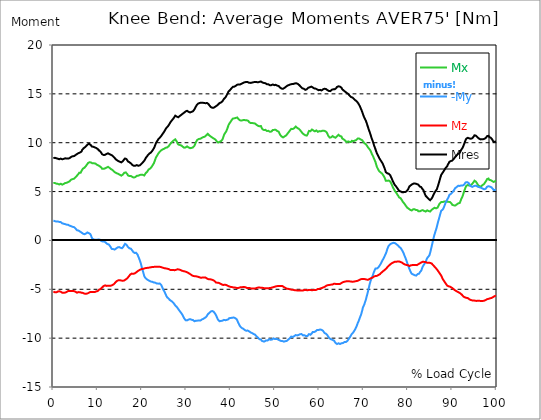
| Category |  Mx |  -My |  Mz |  Mres |
|---|---|---|---|---|
| 0.0 | 5.866 | 2.02 | -5.238 | 8.421 |
| 0.167348456675344 | 5.892 | 1.995 | -5.28 | 8.455 |
| 0.334696913350688 | 5.875 | 1.978 | -5.306 | 8.455 |
| 0.5020453700260321 | 5.858 | 1.961 | -5.314 | 8.447 |
| 0.669393826701376 | 5.815 | 1.927 | -5.314 | 8.413 |
| 0.83674228337672 | 5.781 | 1.927 | -5.263 | 8.37 |
| 1.0040907400520642 | 5.79 | 1.944 | -5.229 | 8.362 |
| 1.1621420602454444 | 5.773 | 1.936 | -5.204 | 8.345 |
| 1.3294905169207885 | 5.722 | 1.893 | -5.204 | 8.311 |
| 1.4968389735961325 | 5.773 | 1.902 | -5.212 | 8.353 |
| 1.6641874302714765 | 5.798 | 1.876 | -5.255 | 8.37 |
| 1.8315358869468206 | 5.739 | 1.791 | -5.323 | 8.336 |
| 1.9988843436221646 | 5.713 | 1.749 | -5.348 | 8.302 |
| 2.1662328002975086 | 5.747 | 1.732 | -5.357 | 8.328 |
| 2.333581256972853 | 5.781 | 1.706 | -5.348 | 8.345 |
| 2.5009297136481967 | 5.824 | 1.681 | -5.348 | 8.37 |
| 2.6682781703235405 | 5.875 | 1.664 | -5.34 | 8.404 |
| 2.8356266269988843 | 5.9 | 1.63 | -5.323 | 8.413 |
| 3.002975083674229 | 5.9 | 1.613 | -5.272 | 8.379 |
| 3.1703235403495724 | 5.934 | 1.604 | -5.229 | 8.379 |
| 3.337671997024917 | 5.968 | 1.596 | -5.178 | 8.379 |
| 3.4957233172182973 | 6.002 | 1.545 | -5.17 | 8.387 |
| 3.663071773893641 | 6.053 | 1.511 | -5.178 | 8.421 |
| 3.8304202305689854 | 6.155 | 1.494 | -5.178 | 8.498 |
| 3.997768687244329 | 6.223 | 1.46 | -5.178 | 8.549 |
| 4.165117143919673 | 6.257 | 1.426 | -5.187 | 8.583 |
| 4.332465600595017 | 6.274 | 1.392 | -5.187 | 8.608 |
| 4.499814057270361 | 6.291 | 1.375 | -5.187 | 8.617 |
| 4.667162513945706 | 6.316 | 1.358 | -5.187 | 8.634 |
| 4.834510970621049 | 6.384 | 1.324 | -5.204 | 8.676 |
| 5.001859427296393 | 6.469 | 1.222 | -5.255 | 8.735 |
| 5.169207883971737 | 6.545 | 1.129 | -5.306 | 8.786 |
| 5.336556340647081 | 6.63 | 1.036 | -5.348 | 8.846 |
| 5.503904797322425 | 6.723 | 1.027 | -5.323 | 8.88 |
| 5.671253253997769 | 6.808 | 1.019 | -5.289 | 8.931 |
| 5.82930457419115 | 6.927 | 0.934 | -5.297 | 9.007 |
| 5.996653030866494 | 6.919 | 0.908 | -5.297 | 8.999 |
| 6.164001487541838 | 6.936 | 0.874 | -5.306 | 9.016 |
| 6.331349944217181 | 7.021 | 0.815 | -5.348 | 9.092 |
| 6.498698400892526 | 7.233 | 0.73 | -5.357 | 9.262 |
| 6.66604685756787 | 7.343 | 0.696 | -5.374 | 9.364 |
| 6.833395314243213 | 7.42 | 0.679 | -5.399 | 9.44 |
| 7.000743770918558 | 7.437 | 0.637 | -5.442 | 9.482 |
| 7.168092227593902 | 7.504 | 0.654 | -5.459 | 9.55 |
| 7.335440684269246 | 7.606 | 0.696 | -5.459 | 9.627 |
| 7.50278914094459 | 7.7 | 0.739 | -5.459 | 9.712 |
| 7.6701375976199335 | 7.819 | 0.815 | -5.433 | 9.797 |
| 7.837486054295278 | 7.929 | 0.798 | -5.382 | 9.856 |
| 7.995537374488658 | 7.954 | 0.747 | -5.357 | 9.856 |
| 8.162885831164003 | 8.005 | 0.705 | -5.323 | 9.865 |
| 8.330234287839346 | 8.056 | 0.654 | -5.28 | 9.856 |
| 8.49758274451469 | 7.971 | 0.484 | -5.263 | 9.729 |
| 8.664931201190035 | 7.895 | 0.28 | -5.272 | 9.618 |
| 8.832279657865378 | 7.887 | 0.161 | -5.289 | 9.593 |
| 8.999628114540721 | 7.903 | 0.136 | -5.28 | 9.584 |
| 9.166976571216066 | 7.895 | 0.093 | -5.28 | 9.559 |
| 9.334325027891412 | 7.861 | 0.034 | -5.28 | 9.525 |
| 9.501673484566755 | 7.861 | 0.059 | -5.255 | 9.516 |
| 9.669021941242098 | 7.81 | 0.085 | -5.221 | 9.457 |
| 9.836370397917442 | 7.742 | 0.076 | -5.204 | 9.389 |
| 10.003718854592787 | 7.717 | 0.068 | -5.178 | 9.355 |
| 10.17106731126813 | 7.674 | 0.093 | -5.102 | 9.279 |
| 10.329118631461512 | 7.623 | 0.11 | -5.026 | 9.194 |
| 10.496467088136853 | 7.581 | 0.076 | -5.009 | 9.143 |
| 10.663815544812199 | 7.521 | 0.008 | -4.966 | 9.067 |
| 10.831164001487544 | 7.445 | -0.068 | -4.924 | 8.982 |
| 10.998512458162887 | 7.326 | -0.102 | -4.813 | 8.82 |
| 11.16586091483823 | 7.292 | -0.11 | -4.729 | 8.752 |
| 11.333209371513574 | 7.326 | -0.102 | -4.669 | 8.744 |
| 11.50055782818892 | 7.386 | -0.102 | -4.635 | 8.778 |
| 11.667906284864264 | 7.377 | -0.153 | -4.601 | 8.761 |
| 11.835254741539607 | 7.386 | -0.229 | -4.601 | 8.778 |
| 12.00260319821495 | 7.454 | -0.306 | -4.652 | 8.854 |
| 12.169951654890292 | 7.513 | -0.374 | -4.669 | 8.905 |
| 12.337300111565641 | 7.53 | -0.391 | -4.644 | 8.914 |
| 12.504648568240984 | 7.488 | -0.407 | -4.618 | 8.863 |
| 12.662699888434362 | 7.428 | -0.484 | -4.627 | 8.829 |
| 12.830048345109708 | 7.369 | -0.611 | -4.627 | 8.795 |
| 12.997396801785053 | 7.301 | -0.747 | -4.627 | 8.752 |
| 13.164745258460396 | 7.233 | -0.866 | -4.61 | 8.71 |
| 13.33209371513574 | 7.207 | -0.849 | -4.567 | 8.676 |
| 13.499442171811083 | 7.156 | -0.883 | -4.525 | 8.617 |
| 13.666790628486426 | 7.055 | -0.917 | -4.465 | 8.523 |
| 13.834139085161771 | 6.987 | -0.934 | -4.389 | 8.43 |
| 14.001487541837117 | 6.936 | -0.891 | -4.296 | 8.345 |
| 14.16883599851246 | 6.902 | -0.823 | -4.219 | 8.277 |
| 14.336184455187803 | 6.868 | -0.764 | -4.151 | 8.209 |
| 14.503532911863147 | 6.834 | -0.713 | -4.109 | 8.167 |
| 14.670881368538492 | 6.808 | -0.679 | -4.075 | 8.124 |
| 14.828932688731873 | 6.783 | -0.679 | -4.058 | 8.09 |
| 14.996281145407215 | 6.715 | -0.705 | -4.066 | 8.048 |
| 15.163629602082558 | 6.673 | -0.756 | -4.092 | 8.014 |
| 15.330978058757903 | 6.63 | -0.806 | -4.109 | 7.988 |
| 15.498326515433247 | 6.673 | -0.798 | -4.117 | 8.031 |
| 15.665674972108594 | 6.74 | -0.73 | -4.126 | 8.107 |
| 15.833023428783937 | 6.842 | -0.62 | -4.143 | 8.218 |
| 16.00037188545928 | 6.927 | -0.467 | -4.1 | 8.311 |
| 16.167720342134626 | 6.995 | -0.348 | -4.049 | 8.387 |
| 16.335068798809967 | 6.961 | -0.382 | -3.99 | 8.353 |
| 16.502417255485312 | 6.91 | -0.45 | -3.939 | 8.319 |
| 16.669765712160658 | 6.791 | -0.552 | -3.88 | 8.201 |
| 16.837114168836 | 6.656 | -0.671 | -3.795 | 8.082 |
| 17.004462625511344 | 6.605 | -0.747 | -3.693 | 8.022 |
| 17.16251394570472 | 6.588 | -0.806 | -3.591 | 7.997 |
| 17.32986240238007 | 6.588 | -0.832 | -3.498 | 7.937 |
| 17.497210859055414 | 6.596 | -0.849 | -3.421 | 7.878 |
| 17.664559315730756 | 6.554 | -0.942 | -3.396 | 7.802 |
| 17.8319077724061 | 6.494 | -1.053 | -3.396 | 7.717 |
| 17.999256229081443 | 6.452 | -1.172 | -3.413 | 7.666 |
| 18.166604685756788 | 6.435 | -1.239 | -3.404 | 7.64 |
| 18.333953142432133 | 6.443 | -1.282 | -3.379 | 7.64 |
| 18.501301599107478 | 6.486 | -1.265 | -3.328 | 7.649 |
| 18.668650055782823 | 6.545 | -1.265 | -3.277 | 7.683 |
| 18.835998512458165 | 6.613 | -1.29 | -3.209 | 7.708 |
| 19.00334696913351 | 6.63 | -1.46 | -3.15 | 7.666 |
| 19.170695425808855 | 6.63 | -1.655 | -3.09 | 7.64 |
| 19.338043882484197 | 6.664 | -1.834 | -3.056 | 7.657 |
| 19.496095202677576 | 6.698 | -2.046 | -3.014 | 7.683 |
| 19.66344365935292 | 6.723 | -2.258 | -2.971 | 7.734 |
| 19.830792116028263 | 6.732 | -2.538 | -2.954 | 7.819 |
| 19.998140572703612 | 6.757 | -2.844 | -2.92 | 7.92 |
| 20.165489029378953 | 6.715 | -3.099 | -2.912 | 7.98 |
| 20.3328374860543 | 6.656 | -3.362 | -2.903 | 8.031 |
| 20.500185942729644 | 6.647 | -3.642 | -2.886 | 8.158 |
| 20.667534399404985 | 6.715 | -3.795 | -2.844 | 8.277 |
| 20.83488285608033 | 6.885 | -3.863 | -2.827 | 8.438 |
| 21.002231312755672 | 6.953 | -3.947 | -2.818 | 8.532 |
| 21.16957976943102 | 7.029 | -4.024 | -2.81 | 8.625 |
| 21.336928226106362 | 7.148 | -4.049 | -2.801 | 8.735 |
| 21.504276682781704 | 7.267 | -4.075 | -2.793 | 8.837 |
| 21.67162513945705 | 7.318 | -4.134 | -2.776 | 8.897 |
| 21.82967645965043 | 7.352 | -4.185 | -2.759 | 8.931 |
| 21.997024916325774 | 7.411 | -4.211 | -2.751 | 8.99 |
| 22.16437337300112 | 7.53 | -4.219 | -2.734 | 9.083 |
| 22.33172182967646 | 7.649 | -4.236 | -2.717 | 9.185 |
| 22.499070286351806 | 7.768 | -4.27 | -2.708 | 9.296 |
| 22.666418743027148 | 7.895 | -4.313 | -2.708 | 9.432 |
| 22.833767199702496 | 8.09 | -4.313 | -2.691 | 9.584 |
| 23.00111565637784 | 8.311 | -4.321 | -2.7 | 9.788 |
| 23.168464113053183 | 8.506 | -4.355 | -2.7 | 9.983 |
| 23.335812569728528 | 8.625 | -4.414 | -2.691 | 10.111 |
| 23.50316102640387 | 8.752 | -4.423 | -2.683 | 10.221 |
| 23.670509483079215 | 8.888 | -4.423 | -2.691 | 10.348 |
| 23.83785793975456 | 8.99 | -4.431 | -2.7 | 10.442 |
| 23.995909259947936 | 9.083 | -4.406 | -2.7 | 10.51 |
| 24.163257716623285 | 9.168 | -4.431 | -2.7 | 10.586 |
| 24.330606173298627 | 9.219 | -4.559 | -2.734 | 10.688 |
| 24.49795462997397 | 9.279 | -4.729 | -2.759 | 10.807 |
| 24.665303086649313 | 9.321 | -4.898 | -2.784 | 10.917 |
| 24.83265154332466 | 9.313 | -5.068 | -2.801 | 11.002 |
| 25.0 | 9.381 | -5.195 | -2.835 | 11.129 |
| 25.167348456675345 | 9.44 | -5.34 | -2.852 | 11.265 |
| 25.334696913350694 | 9.482 | -5.518 | -2.861 | 11.401 |
| 25.502045370026035 | 9.499 | -5.688 | -2.869 | 11.511 |
| 25.669393826701377 | 9.516 | -5.815 | -2.895 | 11.588 |
| 25.836742283376722 | 9.559 | -5.909 | -2.903 | 11.673 |
| 26.004090740052067 | 9.635 | -5.959 | -2.929 | 11.758 |
| 26.17143919672741 | 9.746 | -6.027 | -2.98 | 11.902 |
| 26.329490516920792 | 9.839 | -6.121 | -3.014 | 12.038 |
| 26.49683897359613 | 9.941 | -6.189 | -3.039 | 12.148 |
| 26.66418743027148 | 10.026 | -6.214 | -3.039 | 12.233 |
| 26.831535886946828 | 10.111 | -6.282 | -3.031 | 12.343 |
| 26.998884343622166 | 10.187 | -6.35 | -3.022 | 12.445 |
| 27.166232800297514 | 10.238 | -6.426 | -3.031 | 12.53 |
| 27.333581256972852 | 10.297 | -6.537 | -3.048 | 12.649 |
| 27.5009297136482 | 10.348 | -6.656 | -3.048 | 12.768 |
| 27.668278170323543 | 10.289 | -6.732 | -3.014 | 12.759 |
| 27.835626626998888 | 10.128 | -6.8 | -2.98 | 12.674 |
| 28.002975083674233 | 9.941 | -6.885 | -2.954 | 12.598 |
| 28.170323540349575 | 9.831 | -7.012 | -2.971 | 12.607 |
| 28.33767199702492 | 9.78 | -7.122 | -2.971 | 12.657 |
| 28.50502045370026 | 9.763 | -7.224 | -2.997 | 12.725 |
| 28.663071773893645 | 9.746 | -7.326 | -3.022 | 12.785 |
| 28.830420230568986 | 9.729 | -7.42 | -3.056 | 12.844 |
| 28.99776868724433 | 9.686 | -7.53 | -3.099 | 12.904 |
| 29.165117143919673 | 9.601 | -7.657 | -3.133 | 12.963 |
| 29.33246560059502 | 9.516 | -7.827 | -3.141 | 13.014 |
| 29.499814057270367 | 9.491 | -7.963 | -3.15 | 13.073 |
| 29.66716251394571 | 9.499 | -8.065 | -3.175 | 13.141 |
| 29.834510970621054 | 9.516 | -8.167 | -3.192 | 13.201 |
| 30.00185942729639 | 9.576 | -8.209 | -3.226 | 13.26 |
| 30.169207883971744 | 9.627 | -8.184 | -3.251 | 13.269 |
| 30.33655634064708 | 9.61 | -8.201 | -3.294 | 13.286 |
| 30.50390479732243 | 9.516 | -8.099 | -3.336 | 13.158 |
| 30.671253253997772 | 9.466 | -8.039 | -3.387 | 13.099 |
| 30.829304574191156 | 9.44 | -8.056 | -3.438 | 13.099 |
| 30.996653030866494 | 9.457 | -8.082 | -3.489 | 13.133 |
| 31.164001487541842 | 9.466 | -8.116 | -3.532 | 13.158 |
| 31.331349944217187 | 9.482 | -8.141 | -3.591 | 13.184 |
| 31.498698400892525 | 9.525 | -8.15 | -3.65 | 13.218 |
| 31.666046857567874 | 9.584 | -8.235 | -3.65 | 13.311 |
| 31.833395314243212 | 9.695 | -8.269 | -3.65 | 13.421 |
| 32.00074377091856 | 9.873 | -8.243 | -3.659 | 13.566 |
| 32.1680922275939 | 10.06 | -8.218 | -3.667 | 13.71 |
| 32.33544068426925 | 10.196 | -8.226 | -3.684 | 13.846 |
| 32.50278914094459 | 10.306 | -8.209 | -3.701 | 13.948 |
| 32.670137597619934 | 10.365 | -8.192 | -3.727 | 14.007 |
| 32.83748605429528 | 10.382 | -8.192 | -3.752 | 14.05 |
| 33.004834510970625 | 10.382 | -8.218 | -3.778 | 14.067 |
| 33.162885831164004 | 10.408 | -8.201 | -3.812 | 14.084 |
| 33.33023428783935 | 10.45 | -8.15 | -3.829 | 14.101 |
| 33.497582744514695 | 10.501 | -8.09 | -3.82 | 14.092 |
| 33.664931201190036 | 10.544 | -8.065 | -3.786 | 14.092 |
| 33.83227965786538 | 10.578 | -8.022 | -3.786 | 14.084 |
| 33.99962811454073 | 10.612 | -7.963 | -3.786 | 14.067 |
| 34.16697657121607 | 10.62 | -7.929 | -3.778 | 14.041 |
| 34.33432502789141 | 10.679 | -7.87 | -3.803 | 14.041 |
| 34.50167348456676 | 10.756 | -7.81 | -3.837 | 14.058 |
| 34.6690219412421 | 10.841 | -7.7 | -3.905 | 14.067 |
| 34.83637039791744 | 10.909 | -7.564 | -3.956 | 14.041 |
| 35.00371885459279 | 10.841 | -7.496 | -3.964 | 13.956 |
| 35.17106731126814 | 10.747 | -7.42 | -3.973 | 13.837 |
| 35.338415767943474 | 10.679 | -7.343 | -3.964 | 13.736 |
| 35.49646708813686 | 10.637 | -7.275 | -3.973 | 13.659 |
| 35.6638155448122 | 10.595 | -7.241 | -4.007 | 13.625 |
| 35.831164001487544 | 10.535 | -7.224 | -4.041 | 13.583 |
| 35.998512458162885 | 10.459 | -7.25 | -4.058 | 13.557 |
| 36.165860914838234 | 10.433 | -7.292 | -4.1 | 13.583 |
| 36.333209371513576 | 10.391 | -7.369 | -4.143 | 13.6 |
| 36.50055782818892 | 10.34 | -7.504 | -4.228 | 13.676 |
| 36.667906284864266 | 10.272 | -7.632 | -4.304 | 13.727 |
| 36.83525474153961 | 10.162 | -7.793 | -4.321 | 13.778 |
| 37.002603198214956 | 10.06 | -7.98 | -4.33 | 13.829 |
| 37.1699516548903 | 10.017 | -8.124 | -4.33 | 13.905 |
| 37.337300111565646 | 10.06 | -8.218 | -4.346 | 13.999 |
| 37.50464856824098 | 10.094 | -8.269 | -4.389 | 14.058 |
| 37.66269988843437 | 10.128 | -8.26 | -4.423 | 14.092 |
| 37.83004834510971 | 10.162 | -8.243 | -4.465 | 14.118 |
| 37.99739680178505 | 10.221 | -8.235 | -4.508 | 14.16 |
| 38.16474525846039 | 10.348 | -8.209 | -4.55 | 14.253 |
| 38.33209371513574 | 10.578 | -8.167 | -4.559 | 14.381 |
| 38.49944217181109 | 10.79 | -8.133 | -4.55 | 14.491 |
| 38.666790628486424 | 10.934 | -8.124 | -4.533 | 14.585 |
| 38.83413908516178 | 10.977 | -8.167 | -4.533 | 14.644 |
| 39.001487541837115 | 11.163 | -8.141 | -4.559 | 14.771 |
| 39.16883599851246 | 11.35 | -8.124 | -4.593 | 14.916 |
| 39.336184455187805 | 11.554 | -8.09 | -4.644 | 15.06 |
| 39.503532911863154 | 11.792 | -8.065 | -4.695 | 15.23 |
| 39.670881368538495 | 11.936 | -7.954 | -4.712 | 15.298 |
| 39.83822982521384 | 12.029 | -7.937 | -4.745 | 15.374 |
| 39.996281145407224 | 12.148 | -7.937 | -4.754 | 15.476 |
| 40.163629602082565 | 12.284 | -7.912 | -4.762 | 15.561 |
| 40.33097805875791 | 12.377 | -7.912 | -4.779 | 15.637 |
| 40.498326515433256 | 12.471 | -7.912 | -4.788 | 15.722 |
| 40.6656749721086 | 12.496 | -7.887 | -4.822 | 15.739 |
| 40.83302342878393 | 12.496 | -7.887 | -4.822 | 15.739 |
| 41.00037188545929 | 12.488 | -7.946 | -4.822 | 15.756 |
| 41.16772034213463 | 12.539 | -8.005 | -4.847 | 15.832 |
| 41.33506879880997 | 12.607 | -8.056 | -4.864 | 15.9 |
| 41.50241725548531 | 12.581 | -8.192 | -4.873 | 15.943 |
| 41.66976571216066 | 12.462 | -8.387 | -4.873 | 15.943 |
| 41.837114168836 | 12.411 | -8.523 | -4.847 | 15.951 |
| 42.004462625511344 | 12.318 | -8.684 | -4.822 | 15.951 |
| 42.17181108218669 | 12.275 | -8.812 | -4.796 | 15.968 |
| 42.32986240238007 | 12.267 | -8.88 | -4.779 | 16.011 |
| 42.497210859055414 | 12.258 | -8.956 | -4.779 | 16.045 |
| 42.66455931573076 | 12.292 | -8.999 | -4.779 | 16.087 |
| 42.831907772406105 | 12.326 | -9.041 | -4.771 | 16.13 |
| 42.999256229081446 | 12.335 | -9.1 | -4.771 | 16.155 |
| 43.16660468575679 | 12.326 | -9.16 | -4.779 | 16.189 |
| 43.33395314243214 | 12.292 | -9.236 | -4.788 | 16.206 |
| 43.50130159910748 | 12.275 | -9.245 | -4.83 | 16.214 |
| 43.66865005578282 | 12.292 | -9.253 | -4.864 | 16.231 |
| 43.83599851245817 | 12.267 | -9.219 | -4.856 | 16.206 |
| 44.00334696913351 | 12.225 | -9.219 | -4.856 | 16.18 |
| 44.17069542580886 | 12.106 | -9.304 | -4.847 | 16.13 |
| 44.3380438824842 | 12.038 | -9.381 | -4.881 | 16.113 |
| 44.49609520267758 | 12.012 | -9.415 | -4.898 | 16.121 |
| 44.66344365935292 | 12.004 | -9.449 | -4.915 | 16.13 |
| 44.83079211602827 | 12.012 | -9.482 | -4.924 | 16.155 |
| 44.99814057270361 | 12.012 | -9.525 | -4.932 | 16.18 |
| 45.16548902937895 | 11.995 | -9.576 | -4.941 | 16.197 |
| 45.332837486054295 | 11.987 | -9.601 | -4.932 | 16.206 |
| 45.500185942729644 | 11.961 | -9.644 | -4.915 | 16.206 |
| 45.66753439940499 | 11.902 | -9.72 | -4.898 | 16.206 |
| 45.83488285608033 | 11.834 | -9.814 | -4.873 | 16.206 |
| 46.00223131275568 | 11.809 | -9.865 | -4.839 | 16.206 |
| 46.16957976943102 | 11.732 | -9.949 | -4.822 | 16.18 |
| 46.336928226106366 | 11.724 | -9.992 | -4.813 | 16.189 |
| 46.50427668278171 | 11.681 | -10.111 | -4.839 | 16.231 |
| 46.671625139457056 | 11.741 | -10.111 | -4.83 | 16.274 |
| 46.829676459650436 | 11.707 | -10.136 | -4.822 | 16.265 |
| 46.99702491632577 | 11.511 | -10.263 | -4.839 | 16.206 |
| 47.16437337300112 | 11.384 | -10.331 | -4.847 | 16.164 |
| 47.33172182967646 | 11.35 | -10.331 | -4.864 | 16.147 |
| 47.49907028635181 | 11.308 | -10.331 | -4.873 | 16.113 |
| 47.66641874302716 | 11.265 | -10.331 | -4.898 | 16.096 |
| 47.83376719970249 | 11.316 | -10.272 | -4.898 | 16.087 |
| 48.001115656377834 | 11.291 | -10.23 | -4.89 | 16.045 |
| 48.16846411305319 | 11.206 | -10.238 | -4.898 | 15.985 |
| 48.33581256972853 | 11.155 | -10.238 | -4.898 | 15.951 |
| 48.50316102640387 | 11.214 | -10.204 | -4.898 | 15.977 |
| 48.67050948307921 | 11.231 | -10.111 | -4.881 | 15.926 |
| 48.837857939754564 | 11.129 | -10.145 | -4.881 | 15.883 |
| 49.005206396429905 | 11.121 | -10.162 | -4.864 | 15.883 |
| 49.163257716623285 | 11.138 | -10.17 | -4.847 | 15.892 |
| 49.33060617329863 | 11.223 | -10.145 | -4.822 | 15.926 |
| 49.49795462997397 | 11.299 | -10.111 | -4.796 | 15.96 |
| 49.66530308664932 | 11.325 | -10.026 | -4.779 | 15.9 |
| 49.832651543324666 | 11.316 | -10.026 | -4.754 | 15.892 |
| 50.0 | 11.316 | -10.094 | -4.729 | 15.917 |
| 50.16734845667534 | 11.316 | -10.111 | -4.703 | 15.926 |
| 50.33469691335069 | 11.308 | -10.077 | -4.686 | 15.892 |
| 50.50204537002604 | 11.197 | -10.111 | -4.686 | 15.841 |
| 50.66939382670139 | 11.163 | -10.136 | -4.669 | 15.824 |
| 50.836742283376715 | 11.129 | -10.145 | -4.661 | 15.798 |
| 51.00409074005207 | 10.96 | -10.213 | -4.661 | 15.714 |
| 51.17143919672741 | 10.798 | -10.263 | -4.669 | 15.637 |
| 51.32949051692079 | 10.722 | -10.28 | -4.669 | 15.586 |
| 51.496838973596134 | 10.629 | -10.297 | -4.652 | 15.535 |
| 51.66418743027148 | 10.569 | -10.297 | -4.669 | 15.501 |
| 51.831535886946824 | 10.544 | -10.34 | -4.729 | 15.527 |
| 51.99888434362217 | 10.552 | -10.357 | -4.771 | 15.561 |
| 52.16623280029752 | 10.646 | -10.306 | -4.822 | 15.62 |
| 52.33358125697285 | 10.671 | -10.314 | -4.856 | 15.663 |
| 52.5009297136482 | 10.739 | -10.306 | -4.915 | 15.739 |
| 52.668278170323546 | 10.841 | -10.28 | -4.941 | 15.807 |
| 52.835626626998895 | 10.934 | -10.23 | -4.949 | 15.849 |
| 53.00297508367424 | 11.036 | -10.145 | -4.958 | 15.883 |
| 53.17032354034958 | 11.121 | -10.068 | -4.975 | 15.909 |
| 53.33767199702492 | 11.231 | -10.009 | -4.992 | 15.951 |
| 53.50502045370027 | 11.333 | -9.915 | -5.009 | 15.968 |
| 53.663071773893655 | 11.418 | -9.839 | -5.034 | 15.985 |
| 53.83042023056899 | 11.452 | -9.831 | -5.034 | 16.002 |
| 53.99776868724433 | 11.401 | -9.881 | -5.043 | 16.002 |
| 54.16511714391967 | 11.435 | -9.839 | -5.06 | 16.019 |
| 54.33246560059503 | 11.486 | -9.797 | -5.085 | 16.036 |
| 54.49981405727037 | 11.562 | -9.737 | -5.111 | 16.07 |
| 54.667162513945705 | 11.656 | -9.686 | -5.102 | 16.104 |
| 54.834510970621054 | 11.588 | -9.703 | -5.111 | 16.079 |
| 55.0018594272964 | 11.52 | -9.72 | -5.119 | 16.053 |
| 55.169207883971744 | 11.486 | -9.695 | -5.128 | 16.011 |
| 55.336556340647086 | 11.435 | -9.669 | -5.119 | 15.951 |
| 55.50390479732243 | 11.376 | -9.635 | -5.128 | 15.883 |
| 55.671253253997776 | 11.282 | -9.593 | -5.136 | 15.798 |
| 55.83860171067312 | 11.18 | -9.584 | -5.136 | 15.714 |
| 55.9966530308665 | 11.095 | -9.584 | -5.128 | 15.637 |
| 56.16400148754184 | 10.985 | -9.644 | -5.119 | 15.569 |
| 56.33134994421718 | 10.9 | -9.72 | -5.119 | 15.544 |
| 56.498698400892536 | 10.858 | -9.754 | -5.102 | 15.518 |
| 56.66604685756788 | 10.849 | -9.703 | -5.068 | 15.476 |
| 56.83339531424321 | 10.764 | -9.737 | -5.051 | 15.416 |
| 57.00074377091856 | 10.713 | -9.797 | -5.077 | 15.425 |
| 57.16809222759391 | 10.73 | -9.822 | -5.102 | 15.467 |
| 57.33544068426925 | 10.841 | -9.78 | -5.102 | 15.535 |
| 57.5027891409446 | 11.028 | -9.712 | -5.102 | 15.62 |
| 57.670137597619934 | 11.206 | -9.584 | -5.06 | 15.671 |
| 57.83748605429528 | 11.189 | -9.627 | -5.043 | 15.68 |
| 58.004834510970625 | 11.18 | -9.652 | -5.068 | 15.697 |
| 58.16288583116401 | 11.274 | -9.593 | -5.094 | 15.739 |
| 58.330234287839346 | 11.35 | -9.491 | -5.102 | 15.748 |
| 58.497582744514695 | 11.342 | -9.381 | -5.077 | 15.663 |
| 58.66493120119004 | 11.248 | -9.364 | -5.068 | 15.586 |
| 58.832279657865385 | 11.18 | -9.381 | -5.06 | 15.561 |
| 58.999628114540734 | 11.163 | -9.364 | -5.077 | 15.535 |
| 59.16697657121607 | 11.206 | -9.296 | -5.077 | 15.535 |
| 59.33432502789142 | 11.257 | -9.202 | -5.06 | 15.527 |
| 59.50167348456676 | 11.214 | -9.16 | -5.017 | 15.459 |
| 59.66902194124211 | 11.112 | -9.16 | -4.966 | 15.366 |
| 59.83637039791745 | 11.112 | -9.177 | -4.966 | 15.374 |
| 60.00371885459278 | 11.189 | -9.143 | -4.958 | 15.416 |
| 60.17106731126813 | 11.206 | -9.109 | -4.941 | 15.408 |
| 60.33841576794349 | 11.163 | -9.126 | -4.898 | 15.366 |
| 60.49646708813685 | 11.146 | -9.151 | -4.873 | 15.349 |
| 60.6638155448122 | 11.223 | -9.185 | -4.856 | 15.425 |
| 60.831164001487544 | 11.248 | -9.245 | -4.813 | 15.459 |
| 60.99851245816289 | 11.231 | -9.347 | -4.788 | 15.493 |
| 61.16586091483824 | 11.197 | -9.474 | -4.771 | 15.527 |
| 61.333209371513576 | 11.18 | -9.516 | -4.712 | 15.518 |
| 61.50055782818892 | 11.163 | -9.542 | -4.652 | 15.493 |
| 61.667906284864266 | 11.061 | -9.61 | -4.61 | 15.442 |
| 61.835254741539615 | 10.9 | -9.712 | -4.593 | 15.383 |
| 62.002603198214956 | 10.722 | -9.848 | -4.576 | 15.323 |
| 62.16995165489029 | 10.629 | -9.924 | -4.55 | 15.289 |
| 62.33730011156564 | 10.527 | -10.034 | -4.55 | 15.281 |
| 62.504648568240995 | 10.484 | -10.085 | -4.533 | 15.281 |
| 62.67199702491633 | 10.552 | -10.119 | -4.525 | 15.349 |
| 62.83004834510971 | 10.629 | -10.153 | -4.516 | 15.425 |
| 62.99739680178505 | 10.679 | -10.179 | -4.508 | 15.476 |
| 63.1647452584604 | 10.688 | -10.179 | -4.465 | 15.467 |
| 63.33209371513575 | 10.569 | -10.263 | -4.431 | 15.425 |
| 63.4994421718111 | 10.527 | -10.382 | -4.44 | 15.476 |
| 63.666790628486424 | 10.51 | -10.493 | -4.448 | 15.535 |
| 63.83413908516177 | 10.544 | -10.552 | -4.457 | 15.603 |
| 64.00148754183712 | 10.662 | -10.603 | -4.465 | 15.714 |
| 64.16883599851248 | 10.756 | -10.561 | -4.465 | 15.756 |
| 64.3361844551878 | 10.807 | -10.527 | -4.448 | 15.773 |
| 64.50353291186315 | 10.722 | -10.586 | -4.448 | 15.756 |
| 64.6708813685385 | 10.679 | -10.603 | -4.457 | 15.739 |
| 64.83822982521384 | 10.764 | -10.535 | -4.414 | 15.739 |
| 65.00557828188919 | 10.637 | -10.527 | -4.355 | 15.629 |
| 65.16362960208257 | 10.433 | -10.535 | -4.304 | 15.476 |
| 65.3309780587579 | 10.365 | -10.501 | -4.27 | 15.399 |
| 65.49832651543326 | 10.34 | -10.433 | -4.245 | 15.34 |
| 65.6656749721086 | 10.297 | -10.399 | -4.228 | 15.272 |
| 65.83302342878395 | 10.221 | -10.408 | -4.211 | 15.221 |
| 66.00037188545929 | 10.128 | -10.399 | -4.194 | 15.153 |
| 66.16772034213463 | 10.06 | -10.399 | -4.177 | 15.102 |
| 66.33506879880998 | 10.111 | -10.28 | -4.168 | 15.06 |
| 66.50241725548531 | 10.136 | -10.17 | -4.177 | 15 |
| 66.66976571216065 | 10.128 | -10.06 | -4.185 | 14.924 |
| 66.83711416883601 | 10.085 | -9.949 | -4.194 | 14.822 |
| 67.00446262551135 | 10.068 | -9.822 | -4.194 | 14.72 |
| 67.1718110821867 | 10.085 | -9.729 | -4.211 | 14.678 |
| 67.32986240238007 | 10.196 | -9.567 | -4.219 | 14.669 |
| 67.49721085905541 | 10.187 | -9.499 | -4.236 | 14.618 |
| 67.66455931573076 | 10.162 | -9.406 | -4.219 | 14.542 |
| 67.83190777240611 | 10.153 | -9.304 | -4.211 | 14.466 |
| 67.99925622908145 | 10.213 | -9.16 | -4.194 | 14.406 |
| 68.16660468575678 | 10.23 | -9.024 | -4.177 | 14.33 |
| 68.33395314243214 | 10.28 | -8.863 | -4.16 | 14.262 |
| 68.50130159910749 | 10.374 | -8.668 | -4.16 | 14.203 |
| 68.66865005578282 | 10.433 | -8.464 | -4.134 | 14.101 |
| 68.83599851245816 | 10.433 | -8.302 | -4.109 | 13.999 |
| 69.00334696913352 | 10.425 | -8.09 | -4.049 | 13.854 |
| 69.17069542580886 | 10.416 | -7.878 | -3.998 | 13.71 |
| 69.3380438824842 | 10.331 | -7.691 | -3.973 | 13.532 |
| 69.50539233915956 | 10.289 | -7.471 | -3.947 | 13.362 |
| 69.66344365935292 | 10.255 | -7.182 | -3.939 | 13.158 |
| 69.83079211602826 | 10.221 | -6.868 | -3.931 | 12.946 |
| 69.99814057270362 | 10.051 | -6.707 | -3.947 | 12.725 |
| 70.16548902937896 | 9.941 | -6.528 | -3.956 | 12.556 |
| 70.33283748605429 | 9.89 | -6.282 | -3.964 | 12.386 |
| 70.50018594272964 | 9.848 | -6.053 | -3.99 | 12.25 |
| 70.667534399405 | 9.737 | -5.764 | -4.007 | 12.029 |
| 70.83488285608033 | 9.627 | -5.484 | -4.024 | 11.8 |
| 71.00223131275568 | 9.508 | -5.187 | -4.024 | 11.571 |
| 71.16957976943102 | 9.415 | -4.856 | -3.99 | 11.333 |
| 71.33692822610637 | 9.33 | -4.525 | -3.939 | 11.121 |
| 71.50427668278171 | 9.219 | -4.245 | -3.897 | 10.9 |
| 71.67162513945706 | 9.058 | -4.007 | -3.863 | 10.662 |
| 71.8389735961324 | 8.871 | -3.803 | -3.829 | 10.416 |
| 71.99702491632577 | 8.727 | -3.667 | -3.812 | 10.23 |
| 72.16437337300113 | 8.574 | -3.43 | -3.744 | 10 |
| 72.33172182967647 | 8.379 | -3.217 | -3.693 | 9.746 |
| 72.49907028635181 | 8.209 | -3.039 | -3.667 | 9.542 |
| 72.66641874302715 | 8.022 | -2.878 | -3.642 | 9.33 |
| 72.8337671997025 | 7.751 | -2.861 | -3.633 | 9.1 |
| 73.00111565637783 | 7.513 | -2.878 | -3.625 | 8.905 |
| 73.16846411305319 | 7.36 | -2.827 | -3.591 | 8.761 |
| 73.33581256972853 | 7.216 | -2.751 | -3.54 | 8.608 |
| 73.50316102640387 | 7.089 | -2.64 | -3.498 | 8.438 |
| 73.67050948307921 | 6.987 | -2.53 | -3.455 | 8.311 |
| 73.83785793975457 | 6.961 | -2.402 | -3.387 | 8.226 |
| 74.00520639642991 | 6.893 | -2.25 | -3.302 | 8.082 |
| 74.16325771662328 | 6.834 | -2.097 | -3.234 | 7.963 |
| 74.33060617329863 | 6.74 | -1.97 | -3.166 | 7.819 |
| 74.49795462997398 | 6.613 | -1.825 | -3.107 | 7.64 |
| 74.66530308664932 | 6.477 | -1.672 | -3.048 | 7.454 |
| 74.83265154332466 | 6.308 | -1.511 | -2.988 | 7.241 |
| 75.00000000000001 | 6.104 | -1.358 | -2.92 | 6.987 |
| 75.16734845667534 | 6.07 | -1.138 | -2.844 | 6.885 |
| 75.3346969133507 | 6.104 | -0.891 | -2.751 | 6.868 |
| 75.50204537002605 | 6.138 | -0.696 | -2.674 | 6.859 |
| 75.66939382670138 | 6.129 | -0.552 | -2.589 | 6.825 |
| 75.83674228337672 | 6.112 | -0.45 | -2.513 | 6.783 |
| 76.00409074005208 | 6.027 | -0.382 | -2.453 | 6.664 |
| 76.17143919672742 | 5.875 | -0.348 | -2.394 | 6.503 |
| 76.33878765340276 | 5.722 | -0.306 | -2.335 | 6.341 |
| 76.49683897359614 | 5.543 | -0.272 | -2.301 | 6.155 |
| 76.66418743027148 | 5.365 | -0.246 | -2.267 | 5.976 |
| 76.83153588694682 | 5.246 | -0.238 | -2.233 | 5.849 |
| 76.99888434362218 | 5.094 | -0.263 | -2.19 | 5.696 |
| 77.16623280029752 | 4.992 | -0.314 | -2.182 | 5.603 |
| 77.33358125697285 | 4.89 | -0.365 | -2.182 | 5.518 |
| 77.5009297136482 | 4.771 | -0.441 | -2.173 | 5.408 |
| 77.66827817032356 | 4.652 | -0.484 | -2.156 | 5.297 |
| 77.83562662699889 | 4.542 | -0.543 | -2.156 | 5.187 |
| 78.00297508367423 | 4.406 | -0.645 | -2.156 | 5.068 |
| 78.17032354034959 | 4.33 | -0.688 | -2.173 | 5.009 |
| 78.33767199702493 | 4.321 | -0.773 | -2.207 | 5.017 |
| 78.50502045370027 | 4.236 | -0.883 | -2.241 | 4.983 |
| 78.67236891037561 | 4.1 | -1.002 | -2.275 | 4.932 |
| 78.83042023056899 | 3.956 | -1.155 | -2.326 | 4.898 |
| 78.99776868724433 | 3.914 | -1.29 | -2.394 | 4.941 |
| 79.16511714391969 | 3.778 | -1.503 | -2.428 | 4.941 |
| 79.33246560059503 | 3.667 | -1.681 | -2.462 | 4.949 |
| 79.49981405727036 | 3.557 | -1.868 | -2.487 | 4.983 |
| 79.66716251394571 | 3.455 | -2.08 | -2.513 | 5.026 |
| 79.83451097062107 | 3.353 | -2.301 | -2.521 | 5.094 |
| 80.00185942729641 | 3.285 | -2.521 | -2.538 | 5.212 |
| 80.16920788397174 | 3.243 | -2.725 | -2.581 | 5.374 |
| 80.33655634064709 | 3.2 | -2.937 | -2.615 | 5.535 |
| 80.50390479732243 | 3.133 | -3.107 | -2.581 | 5.603 |
| 80.67125325399778 | 3.073 | -3.268 | -2.547 | 5.654 |
| 80.83860171067312 | 3.065 | -3.404 | -2.53 | 5.713 |
| 80.99665303086651 | 3.116 | -3.455 | -2.521 | 5.764 |
| 81.16400148754184 | 3.183 | -3.481 | -2.513 | 5.807 |
| 81.3313499442172 | 3.226 | -3.54 | -2.504 | 5.832 |
| 81.49869840089255 | 3.183 | -3.557 | -2.513 | 5.841 |
| 81.66604685756786 | 3.133 | -3.608 | -2.504 | 5.815 |
| 81.83339531424322 | 3.107 | -3.599 | -2.496 | 5.798 |
| 82.00074377091858 | 3.116 | -3.523 | -2.53 | 5.773 |
| 82.16809222759392 | 3.099 | -3.447 | -2.538 | 5.747 |
| 82.33544068426926 | 2.98 | -3.464 | -2.436 | 5.705 |
| 82.50278914094459 | 2.946 | -3.404 | -2.377 | 5.628 |
| 82.67013759761994 | 2.98 | -3.268 | -2.343 | 5.518 |
| 82.83748605429528 | 3.048 | -3.192 | -2.318 | 5.518 |
| 83.00483451097062 | 3.056 | -3.082 | -2.258 | 5.45 |
| 83.17218296764597 | 3.082 | -2.869 | -2.199 | 5.323 |
| 83.33023428783935 | 3.099 | -2.674 | -2.182 | 5.246 |
| 83.4975827445147 | 3.065 | -2.547 | -2.19 | 5.128 |
| 83.66493120119004 | 3.014 | -2.428 | -2.199 | 4.932 |
| 83.83227965786537 | 2.946 | -2.335 | -2.19 | 4.72 |
| 83.99962811454073 | 2.954 | -2.182 | -2.216 | 4.567 |
| 84.16697657121607 | 3.014 | -1.986 | -2.258 | 4.482 |
| 84.33432502789142 | 3.082 | -1.8 | -2.292 | 4.406 |
| 84.50167348456677 | 3.048 | -1.715 | -2.292 | 4.321 |
| 84.6690219412421 | 3.005 | -1.63 | -2.275 | 4.245 |
| 84.83637039791745 | 2.954 | -1.511 | -2.284 | 4.168 |
| 85.0037188545928 | 2.954 | -1.273 | -2.301 | 4.117 |
| 85.17106731126813 | 3.039 | -0.951 | -2.326 | 4.202 |
| 85.33841576794349 | 3.133 | -0.628 | -2.36 | 4.287 |
| 85.50576422461883 | 3.183 | -0.306 | -2.436 | 4.406 |
| 85.66381554481221 | 3.243 | 0.034 | -2.521 | 4.584 |
| 85.83116400148755 | 3.294 | 0.357 | -2.606 | 4.754 |
| 85.99851245816289 | 3.345 | 0.628 | -2.691 | 4.89 |
| 86.16586091483823 | 3.37 | 0.874 | -2.759 | 5.009 |
| 86.33320937151358 | 3.285 | 1.104 | -2.852 | 5.094 |
| 86.50055782818893 | 3.26 | 1.367 | -2.954 | 5.229 |
| 86.66790628486427 | 3.353 | 1.681 | -3.048 | 5.45 |
| 86.83525474153961 | 3.498 | 1.97 | -3.158 | 5.688 |
| 87.00260319821496 | 3.659 | 2.233 | -3.268 | 5.934 |
| 87.16995165489031 | 3.786 | 2.513 | -3.379 | 6.206 |
| 87.33730011156564 | 3.888 | 2.793 | -3.489 | 6.469 |
| 87.504648568241 | 3.922 | 3.039 | -3.599 | 6.707 |
| 87.67199702491634 | 3.888 | 3.133 | -3.761 | 6.825 |
| 87.83004834510972 | 3.922 | 3.158 | -3.947 | 6.936 |
| 87.99739680178506 | 3.973 | 3.277 | -4.058 | 7.046 |
| 88.1647452584604 | 3.981 | 3.472 | -4.16 | 7.182 |
| 88.33209371513574 | 3.973 | 3.667 | -4.287 | 7.292 |
| 88.49944217181108 | 3.99 | 3.871 | -4.397 | 7.42 |
| 88.66679062848644 | 3.99 | 4.015 | -4.508 | 7.521 |
| 88.83413908516178 | 3.956 | 4.066 | -4.618 | 7.572 |
| 89.00148754183712 | 3.973 | 4.304 | -4.661 | 7.768 |
| 89.16883599851246 | 3.947 | 4.448 | -4.695 | 7.878 |
| 89.33618445518782 | 3.956 | 4.661 | -4.686 | 8.039 |
| 89.50353291186315 | 3.931 | 4.72 | -4.737 | 8.09 |
| 89.6708813685385 | 3.897 | 4.762 | -4.771 | 8.124 |
| 89.83822982521386 | 3.769 | 4.839 | -4.822 | 8.15 |
| 90.00557828188919 | 3.642 | 4.915 | -4.864 | 8.175 |
| 90.16362960208257 | 3.591 | 5.017 | -4.932 | 8.243 |
| 90.3309780587579 | 3.591 | 5.119 | -5 | 8.345 |
| 90.49832651543326 | 3.574 | 5.238 | -5.068 | 8.438 |
| 90.66567497210859 | 3.565 | 5.357 | -5.119 | 8.549 |
| 90.83302342878395 | 3.616 | 5.416 | -5.161 | 8.634 |
| 91.00037188545929 | 3.684 | 5.467 | -5.221 | 8.718 |
| 91.16772034213463 | 3.778 | 5.535 | -5.255 | 8.82 |
| 91.33506879880998 | 3.795 | 5.594 | -5.289 | 8.88 |
| 91.50241725548533 | 3.752 | 5.56 | -5.331 | 8.888 |
| 91.66976571216065 | 3.829 | 5.577 | -5.374 | 8.965 |
| 91.83711416883601 | 4.007 | 5.62 | -5.425 | 9.117 |
| 92.00446262551137 | 4.211 | 5.628 | -5.484 | 9.262 |
| 92.1718110821867 | 4.38 | 5.628 | -5.56 | 9.381 |
| 92.33915953886203 | 4.542 | 5.62 | -5.662 | 9.491 |
| 92.49721085905541 | 4.779 | 5.654 | -5.739 | 9.669 |
| 92.66455931573077 | 5.034 | 5.705 | -5.807 | 9.865 |
| 92.83190777240611 | 5.229 | 5.824 | -5.824 | 10.077 |
| 92.99925622908145 | 5.433 | 5.934 | -5.849 | 10.28 |
| 93.1666046857568 | 5.586 | 5.959 | -5.875 | 10.416 |
| 93.33395314243214 | 5.645 | 5.968 | -5.892 | 10.476 |
| 93.50130159910749 | 5.679 | 5.959 | -5.9 | 10.501 |
| 93.66865005578283 | 5.662 | 5.892 | -5.942 | 10.484 |
| 93.83599851245818 | 5.611 | 5.756 | -6.019 | 10.442 |
| 94.00334696913353 | 5.645 | 5.679 | -6.044 | 10.433 |
| 94.17069542580886 | 5.671 | 5.552 | -6.095 | 10.408 |
| 94.3380438824842 | 5.739 | 5.526 | -6.112 | 10.442 |
| 94.50539233915954 | 5.79 | 5.484 | -6.138 | 10.459 |
| 94.66344365935292 | 5.832 | 5.501 | -6.129 | 10.493 |
| 94.83079211602828 | 5.993 | 5.552 | -6.138 | 10.629 |
| 94.99814057270362 | 6.112 | 5.594 | -6.163 | 10.756 |
| 95.16548902937897 | 6.121 | 5.603 | -6.18 | 10.773 |
| 95.33283748605432 | 6.01 | 5.586 | -6.189 | 10.722 |
| 95.50018594272963 | 5.892 | 5.569 | -6.189 | 10.646 |
| 95.66753439940499 | 5.773 | 5.526 | -6.18 | 10.561 |
| 95.83488285608034 | 5.645 | 5.476 | -6.172 | 10.476 |
| 96.00223131275567 | 5.594 | 5.459 | -6.172 | 10.433 |
| 96.16957976943102 | 5.535 | 5.442 | -6.18 | 10.374 |
| 96.33692822610638 | 5.501 | 5.408 | -6.189 | 10.34 |
| 96.50427668278171 | 5.526 | 5.382 | -6.206 | 10.348 |
| 96.67162513945706 | 5.586 | 5.348 | -6.206 | 10.357 |
| 96.8389735961324 | 5.671 | 5.306 | -6.197 | 10.374 |
| 96.99702491632577 | 5.713 | 5.263 | -6.172 | 10.365 |
| 97.16437337300111 | 5.773 | 5.229 | -6.172 | 10.365 |
| 97.33172182967647 | 5.892 | 5.229 | -6.155 | 10.416 |
| 97.49907028635181 | 5.968 | 5.28 | -6.104 | 10.442 |
| 97.66641874302715 | 6.121 | 5.382 | -6.053 | 10.544 |
| 97.8337671997025 | 6.274 | 5.484 | -6.019 | 10.671 |
| 98.00111565637785 | 6.341 | 5.535 | -5.993 | 10.713 |
| 98.16846411305319 | 6.333 | 5.552 | -5.976 | 10.705 |
| 98.33581256972855 | 6.197 | 5.526 | -5.951 | 10.586 |
| 98.50316102640389 | 6.18 | 5.501 | -5.925 | 10.544 |
| 98.67050948307921 | 6.172 | 5.467 | -5.909 | 10.51 |
| 98.83785793975456 | 6.146 | 5.433 | -5.892 | 10.45 |
| 99.0052063964299 | 6.07 | 5.382 | -5.858 | 10.34 |
| 99.17255485310525 | 5.985 | 5.263 | -5.807 | 10.187 |
| 99.33060617329863 | 5.985 | 5.153 | -5.747 | 10.077 |
| 99.49795462997399 | 6.036 | 5.136 | -5.713 | 10.077 |
| 99.66530308664933 | 6.061 | 5.178 | -5.671 | 10.102 |
| 99.83265154332467 | 6.078 | 5.229 | -5.637 | 10.119 |
| 100.0 | 6.138 | 5.212 | -5.594 | 10.136 |